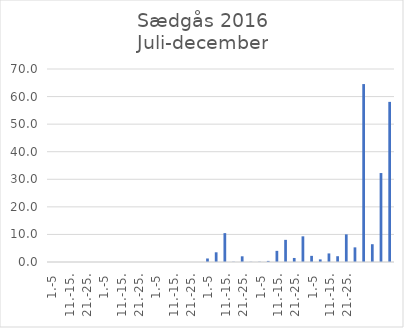
| Category | Series 0 |
|---|---|
| 1.-5 | 0 |
| 6.-10. | 0 |
| 11.-15. | 0 |
| 16.-20. | 0 |
| 21.-25. | 0 |
| 26.-31. | 0 |
| 1.-5 | 0 |
| 6.-10. | 0 |
| 11.-15. | 0 |
| 16.-20. | 0 |
| 21.-25. | 0 |
| 26.-31. | 0 |
| 1.-5 | 0 |
| 6.-10. | 0 |
| 11.-15. | 0 |
| 16.-20. | 0 |
| 21.-25. | 0 |
| 26.-30. | 0 |
| 1.-5 | 1.276 |
| 6.-10. | 3.518 |
| 11.-15. | 10.47 |
| 16.-20. | 0.084 |
| 21.-25. | 2.066 |
| 26.-31. | 0.072 |
| 1.-5 | 0.091 |
| 6.-10. | 0.395 |
| 11.-15. | 4.041 |
| 16.-20. | 8.033 |
| 21.-25. | 1.463 |
| 26.-30. | 9.31 |
| 1.-5 | 2.228 |
| 6.-10. | 0.944 |
| 11.-15. | 3.108 |
| 16.-20. | 2.097 |
| 21.-25. | 10.027 |
| 26.-31. | 5.309 |